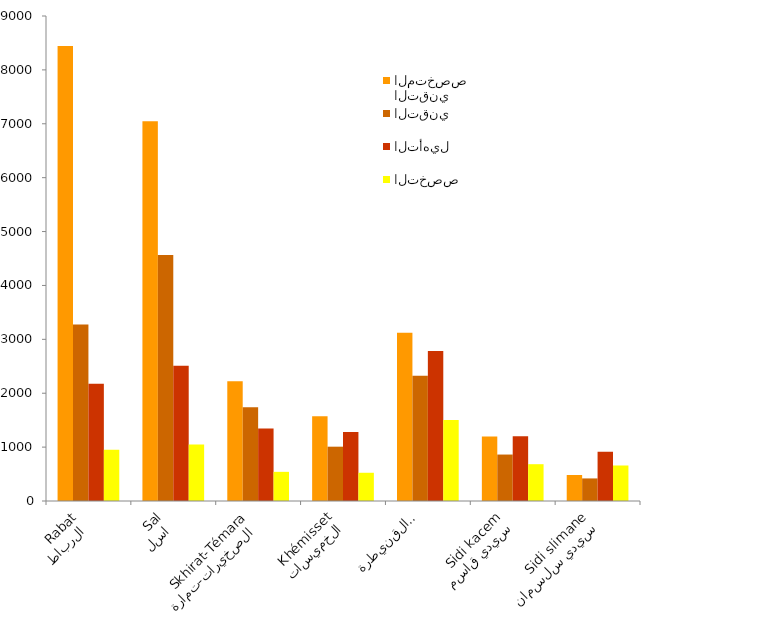
| Category | التقني المتخصص | التقني | التأهيل | التخصص     |
|---|---|---|---|---|
| الرباط 
Rabat | 8441 | 3273 | 2174 | 949 |
| سلا 
 Salé | 7047 | 4565 | 2512 | 1048 |
| الصخيرات-تمارة 
Skhirat-Témara | 2221 | 1742 | 1344 | 541 |
| الخميسات
Khémisset | 1571 | 1008 | 1280 | 524 |
| القنيطرة
kénitra | 3120 | 2325 | 2784 | 1503 |
| سيدي قاسم
Sidi kacem | 1195 | 862 | 1200 | 683 |
| سيدي سلسمان
Sidi slimane | 482 | 419 | 914 | 659 |